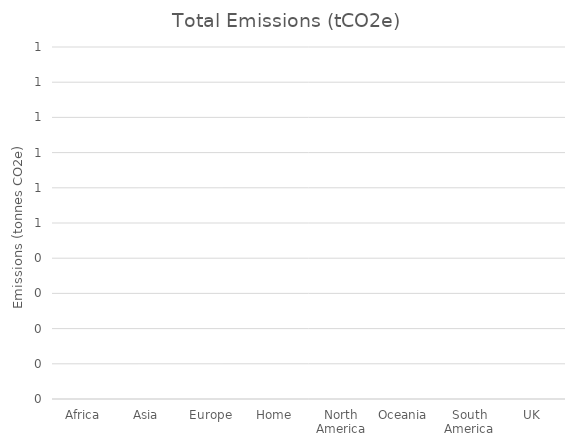
| Category | Total Emissions (tCO2e) |
|---|---|
| Africa | 0 |
| Asia | 0 |
| Europe | 0 |
| Home | 0 |
| North America | 0 |
| Oceania | 0 |
| South America | 0 |
| UK | 0 |